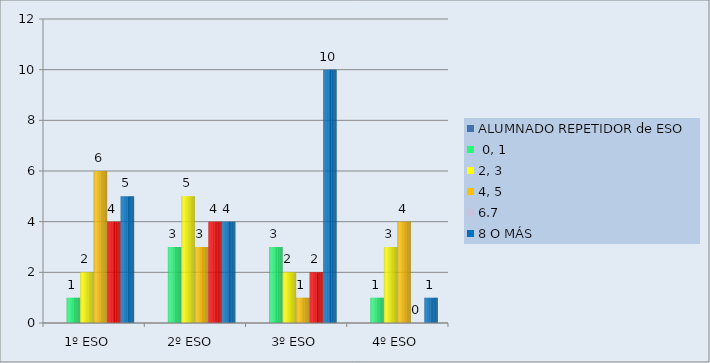
| Category | ALUMNADO REPETIDOR de ESO | 0, 1 | 2, 3 | 4, 5 | 6,7 | 8 O MÁS |
|---|---|---|---|---|---|---|
| 1º ESO   |  | 1 | 2 | 6 | 4 | 5 |
| 2º ESO  |  | 3 | 5 | 3 | 4 | 4 |
| 3º ESO |  | 3 | 2 | 1 | 2 | 10 |
| 4º ESO |  | 1 | 3 | 4 | 0 | 1 |